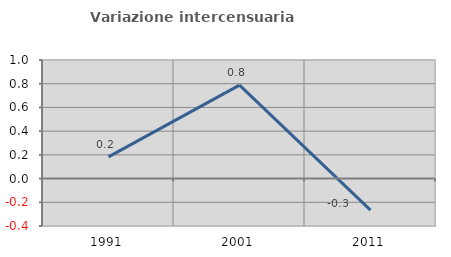
| Category | Variazione intercensuaria annua |
|---|---|
| 1991.0 | 0.183 |
| 2001.0 | 0.789 |
| 2011.0 | -0.266 |